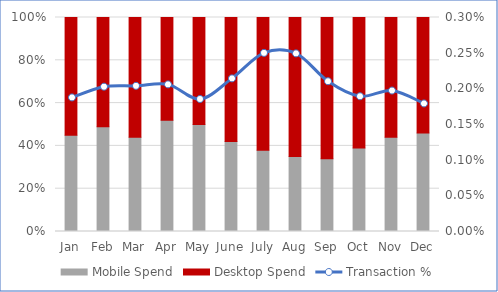
| Category | Mobile Spend | Desktop Spend |
|---|---|---|
| Jan | 359084.547 | 438881.113 |
| Feb | 295945.202 | 308024.598 |
| Mar | 228830.435 | 291238.735 |
| Apr | 376750.665 | 347769.845 |
| May | 343226.55 | 343226.55 |
| June | 164481.345 | 227140.905 |
| July | 161303.882 | 263180.018 |
| Aug | 127172.62 | 236177.723 |
| Sep | 111113.965 | 215691.815 |
| Oct | 174805.394 | 273413.566 |
| Nov | 210181.023 | 267503.12 |
| Dec | 264672.333 | 310702.304 |